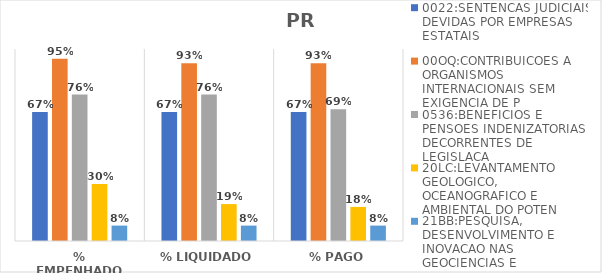
| Category | 0022:SENTENCAS JUDICIAIS DEVIDAS POR EMPRESAS ESTATAIS | 00OQ:CONTRIBUICOES A ORGANISMOS INTERNACIONAIS SEM EXIGENCIA DE P | 0536:BENEFICIOS E PENSOES INDENIZATORIAS DECORRENTES DE LEGISLACA | 20LC:LEVANTAMENTO GEOLOGICO, OCEANOGRAFICO E AMBIENTAL DO POTEN | 21BB:PESQUISA, DESENVOLVIMENTO E INOVACAO NAS GEOCIENCIAS E |
|---|---|---|---|---|---|
| % EMPENHADO | 0.671 | 0.95 | 0.763 | 0.297 | 0.08 |
| % LIQUIDADO | 0.671 | 0.926 | 0.763 | 0.192 | 0.08 |
| % PAGO | 0.671 | 0.926 | 0.687 | 0.178 | 0.08 |